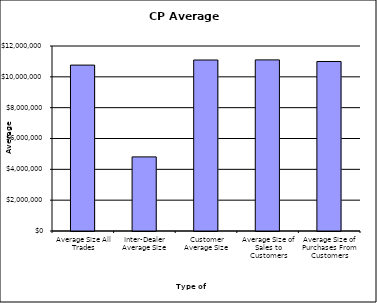
| Category | Security Type |
|---|---|
| Average Size All Trades | 10761271.86 |
| Inter-Dealer Average Size | 4807151.515 |
| Customer Average Size | 11090946.309 |
| Average Size of Sales to Customers | 11099786.434 |
| Average Size of Purchases From Customers | 10995455.446 |